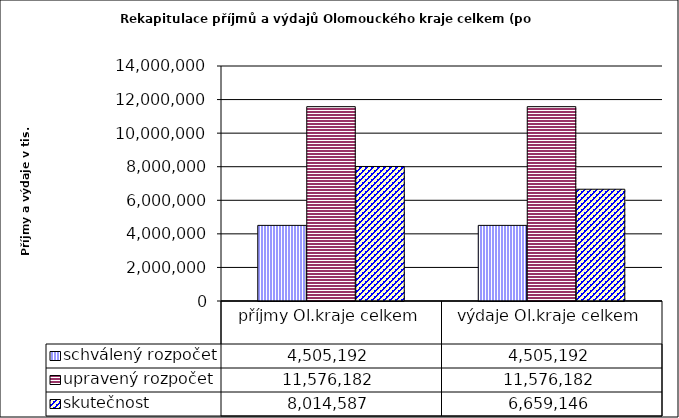
| Category | schválený rozpočet | upravený rozpočet | skutečnost |
|---|---|---|---|
| příjmy Ol.kraje celkem | 4505192 | 11576182 | 8014587 |
| výdaje Ol.kraje celkem | 4505192 | 11576182 | 6659146 |